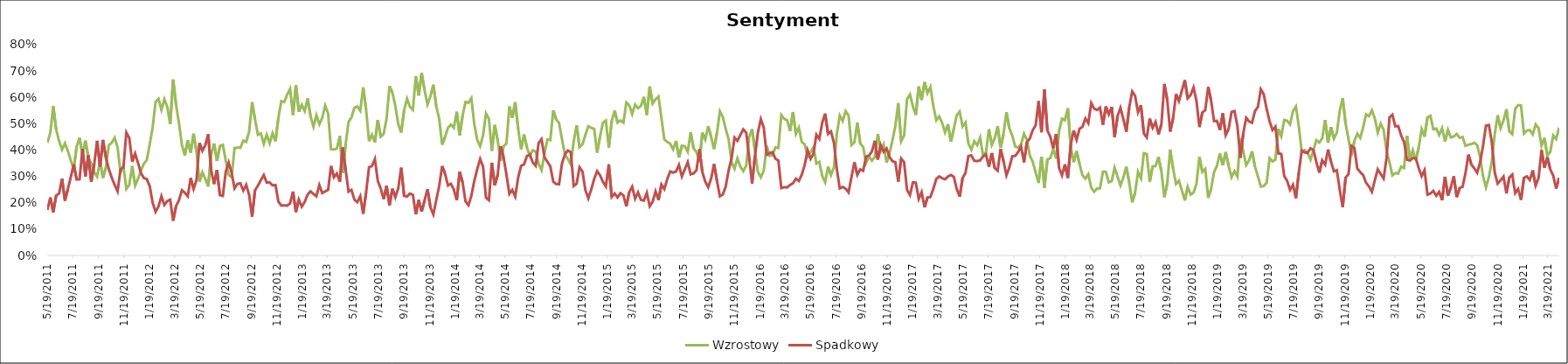
| Category | Wzrostowy | Spadkowy |
|---|---|---|
| 5/19/11 | 0.428 | 0.173 |
| 5/26/11 | 0.465 | 0.22 |
| 6/2/11 | 0.567 | 0.164 |
| 6/9/11 | 0.478 | 0.228 |
| 6/16/11 | 0.434 | 0.235 |
| 6/23/11 | 0.402 | 0.291 |
| 6/30/11 | 0.426 | 0.208 |
| 7/7/11 | 0.397 | 0.252 |
| 7/14/11 | 0.36 | 0.297 |
| 7/21/11 | 0.327 | 0.346 |
| 7/28/11 | 0.413 | 0.288 |
| 8/4/11 | 0.446 | 0.289 |
| 8/11/11 | 0.382 | 0.403 |
| 8/18/11 | 0.436 | 0.3 |
| 8/25/11 | 0.372 | 0.38 |
| 9/1/11 | 0.349 | 0.279 |
| 9/8/11 | 0.317 | 0.345 |
| 9/15/11 | 0.299 | 0.435 |
| 9/22/11 | 0.358 | 0.338 |
| 9/29/11 | 0.295 | 0.438 |
| 10/6/11 | 0.333 | 0.372 |
| 10/13/11 | 0.418 | 0.328 |
| 10/20/11 | 0.427 | 0.295 |
| 10/27/11 | 0.447 | 0.268 |
| 11/3/11 | 0.41 | 0.244 |
| 11/10/11 | 0.315 | 0.327 |
| 11/17/11 | 0.34 | 0.334 |
| 11/24/11 | 0.252 | 0.466 |
| 12/1/11 | 0.269 | 0.446 |
| 12/8/11 | 0.34 | 0.355 |
| 12/15/11 | 0.265 | 0.387 |
| 12/22/11 | 0.292 | 0.351 |
| 12/29/11 | 0.322 | 0.312 |
| 1/5/12 | 0.348 | 0.294 |
| 1/12/12 | 0.363 | 0.29 |
| 1/19/12 | 0.422 | 0.263 |
| 1/26/12 | 0.487 | 0.2 |
| 2/2/12 | 0.583 | 0.166 |
| 2/9/12 | 0.595 | 0.186 |
| 2/16/12 | 0.553 | 0.225 |
| 2/23/12 | 0.593 | 0.192 |
| 3/1/12 | 0.564 | 0.207 |
| 3/8/12 | 0.498 | 0.212 |
| 3/15/12 | 0.668 | 0.132 |
| 3/22/12 | 0.571 | 0.187 |
| 3/29/12 | 0.503 | 0.21 |
| 4/5/12 | 0.419 | 0.248 |
| 4/12/12 | 0.379 | 0.238 |
| 4/19/12 | 0.436 | 0.225 |
| 4/26/12 | 0.39 | 0.294 |
| 5/3/12 | 0.462 | 0.252 |
| 5/10/12 | 0.393 | 0.286 |
| 5/17/12 | 0.28 | 0.427 |
| 5/24/12 | 0.316 | 0.397 |
| 5/31/12 | 0.291 | 0.419 |
| 6/7/12 | 0.262 | 0.46 |
| 6/14/12 | 0.382 | 0.324 |
| 6/21/12 | 0.425 | 0.271 |
| 6/28/12 | 0.359 | 0.324 |
| 7/5/12 | 0.415 | 0.229 |
| 7/12/12 | 0.42 | 0.226 |
| 7/19/12 | 0.36 | 0.318 |
| 7/26/12 | 0.305 | 0.353 |
| 8/2/12 | 0.297 | 0.314 |
| 8/9/12 | 0.408 | 0.255 |
| 8/16/12 | 0.409 | 0.272 |
| 8/23/12 | 0.409 | 0.274 |
| 8/30/12 | 0.436 | 0.246 |
| 9/6/12 | 0.431 | 0.268 |
| 9/13/12 | 0.47 | 0.229 |
| 9/20/12 | 0.582 | 0.147 |
| 9/27/12 | 0.517 | 0.247 |
| 10/4/12 | 0.458 | 0.265 |
| 10/11/12 | 0.463 | 0.286 |
| 10/18/12 | 0.424 | 0.305 |
| 10/25/12 | 0.458 | 0.277 |
| 11/1/12 | 0.426 | 0.278 |
| 11/8/12 | 0.464 | 0.266 |
| 11/15/12 | 0.433 | 0.267 |
| 11/22/12 | 0.522 | 0.205 |
| 11/29/12 | 0.586 | 0.189 |
| 12/6/12 | 0.582 | 0.19 |
| 12/13/12 | 0.61 | 0.189 |
| 12/20/12 | 0.632 | 0.198 |
| 12/27/12 | 0.533 | 0.243 |
| 1/3/13 | 0.647 | 0.165 |
| 1/10/13 | 0.545 | 0.212 |
| 1/17/13 | 0.571 | 0.185 |
| 1/24/13 | 0.548 | 0.203 |
| 1/31/13 | 0.596 | 0.231 |
| 2/7/13 | 0.528 | 0.243 |
| 2/14/13 | 0.489 | 0.233 |
| 2/21/13 | 0.533 | 0.225 |
| 2/28/13 | 0.498 | 0.267 |
| 3/7/13 | 0.522 | 0.237 |
| 3/14/13 | 0.569 | 0.243 |
| 3/21/13 | 0.539 | 0.249 |
| 3/28/13 | 0.403 | 0.34 |
| 4/4/13 | 0.402 | 0.297 |
| 4/11/13 | 0.406 | 0.311 |
| 4/18/13 | 0.453 | 0.28 |
| 4/25/13 | 0.313 | 0.41 |
| 5/2/13 | 0.422 | 0.325 |
| 5/9/13 | 0.507 | 0.242 |
| 5/16/13 | 0.524 | 0.249 |
| 5/23/13 | 0.561 | 0.212 |
| 5/30/13 | 0.566 | 0.202 |
| 6/6/13 | 0.549 | 0.225 |
| 6/13/13 | 0.638 | 0.158 |
| 6/20/13 | 0.553 | 0.24 |
| 6/27/13 | 0.433 | 0.335 |
| 7/4/13 | 0.458 | 0.34 |
| 7/11/13 | 0.429 | 0.366 |
| 7/18/13 | 0.514 | 0.283 |
| 7/25/13 | 0.451 | 0.254 |
| 8/1/13 | 0.462 | 0.214 |
| 8/8/13 | 0.519 | 0.265 |
| 8/15/13 | 0.642 | 0.19 |
| 8/22/13 | 0.618 | 0.253 |
| 8/29/13 | 0.567 | 0.221 |
| 9/5/13 | 0.498 | 0.255 |
| 9/12/13 | 0.467 | 0.333 |
| 9/19/13 | 0.552 | 0.226 |
| 9/26/13 | 0.595 | 0.224 |
| 10/3/13 | 0.564 | 0.235 |
| 10/10/13 | 0.552 | 0.23 |
| 10/17/13 | 0.68 | 0.156 |
| 10/24/13 | 0.607 | 0.211 |
| 10/31/13 | 0.693 | 0.167 |
| 11/7/13 | 0.627 | 0.209 |
| 11/14/13 | 0.573 | 0.252 |
| 11/21/13 | 0.604 | 0.182 |
| 11/28/13 | 0.648 | 0.155 |
| 12/5/13 | 0.566 | 0.211 |
| 12/12/13 | 0.519 | 0.264 |
| 12/19/13 | 0.42 | 0.339 |
| 12/26/13 | 0.45 | 0.31 |
| 1/2/14 | 0.484 | 0.266 |
| 1/9/14 | 0.497 | 0.272 |
| 1/16/14 | 0.484 | 0.25 |
| 1/23/14 | 0.545 | 0.21 |
| 1/30/14 | 0.455 | 0.317 |
| 2/6/14 | 0.531 | 0.278 |
| 2/13/14 | 0.582 | 0.205 |
| 2/20/14 | 0.579 | 0.191 |
| 2/27/14 | 0.597 | 0.227 |
| 3/6/14 | 0.498 | 0.283 |
| 3/13/14 | 0.439 | 0.327 |
| 3/20/14 | 0.415 | 0.366 |
| 3/27/14 | 0.455 | 0.337 |
| 4/3/14 | 0.539 | 0.219 |
| 4/10/14 | 0.519 | 0.21 |
| 4/17/14 | 0.397 | 0.352 |
| 4/24/14 | 0.495 | 0.266 |
| 5/1/14 | 0.437 | 0.306 |
| 5/8/14 | 0.359 | 0.415 |
| 5/15/14 | 0.414 | 0.374 |
| 5/22/14 | 0.425 | 0.307 |
| 5/29/14 | 0.566 | 0.234 |
| 6/5/14 | 0.522 | 0.249 |
| 6/12/14 | 0.581 | 0.224 |
| 6/19/14 | 0.482 | 0.295 |
| 6/26/14 | 0.403 | 0.34 |
| 7/3/14 | 0.459 | 0.345 |
| 7/10/14 | 0.41 | 0.377 |
| 7/17/14 | 0.379 | 0.383 |
| 7/24/14 | 0.399 | 0.353 |
| 7/31/14 | 0.394 | 0.34 |
| 8/7/14 | 0.348 | 0.427 |
| 8/14/14 | 0.324 | 0.441 |
| 8/21/14 | 0.386 | 0.373 |
| 8/28/14 | 0.44 | 0.356 |
| 9/4/14 | 0.438 | 0.338 |
| 9/11/14 | 0.551 | 0.28 |
| 9/18/14 | 0.516 | 0.271 |
| 9/25/14 | 0.502 | 0.271 |
| 10/2/14 | 0.441 | 0.349 |
| 10/9/14 | 0.383 | 0.383 |
| 10/16/14 | 0.366 | 0.398 |
| 10/23/14 | 0.345 | 0.392 |
| 10/30/14 | 0.433 | 0.264 |
| 11/6/14 | 0.494 | 0.272 |
| 11/13/14 | 0.411 | 0.335 |
| 11/20/14 | 0.422 | 0.319 |
| 11/27/14 | 0.457 | 0.248 |
| 12/4/14 | 0.49 | 0.217 |
| 12/11/14 | 0.484 | 0.251 |
| 12/18/14 | 0.481 | 0.29 |
| 12/25/14 | 0.39 | 0.32 |
| 1/1/15 | 0.451 | 0.304 |
| 1/8/15 | 0.503 | 0.28 |
| 1/15/15 | 0.512 | 0.262 |
| 1/22/15 | 0.409 | 0.346 |
| 1/29/15 | 0.511 | 0.222 |
| 2/5/15 | 0.55 | 0.235 |
| 2/12/15 | 0.504 | 0.22 |
| 2/19/15 | 0.512 | 0.236 |
| 2/26/15 | 0.504 | 0.228 |
| 3/5/15 | 0.581 | 0.186 |
| 3/12/15 | 0.57 | 0.241 |
| 3/19/15 | 0.537 | 0.261 |
| 3/26/15 | 0.573 | 0.216 |
| 4/2/15 | 0.559 | 0.239 |
| 4/9/15 | 0.568 | 0.211 |
| 4/16/15 | 0.602 | 0.208 |
| 4/23/15 | 0.533 | 0.238 |
| 4/30/15 | 0.641 | 0.187 |
| 5/7/15 | 0.577 | 0.204 |
| 5/14/15 | 0.593 | 0.243 |
| 5/21/15 | 0.603 | 0.21 |
| 5/28/15 | 0.521 | 0.269 |
| 6/4/15 | 0.44 | 0.252 |
| 6/11/15 | 0.431 | 0.29 |
| 6/18/15 | 0.424 | 0.319 |
| 6/25/15 | 0.403 | 0.314 |
| 7/2/15 | 0.435 | 0.319 |
| 7/9/15 | 0.372 | 0.344 |
| 7/16/15 | 0.416 | 0.3 |
| 7/23/15 | 0.415 | 0.327 |
| 7/30/15 | 0.393 | 0.354 |
| 8/6/15 | 0.467 | 0.308 |
| 8/13/15 | 0.407 | 0.311 |
| 8/20/15 | 0.392 | 0.324 |
| 8/27/15 | 0.357 | 0.403 |
| 9/3/15 | 0.466 | 0.316 |
| 9/10/15 | 0.44 | 0.28 |
| 9/17/15 | 0.49 | 0.259 |
| 9/24/15 | 0.451 | 0.292 |
| 10/1/15 | 0.404 | 0.347 |
| 10/8/15 | 0.466 | 0.283 |
| 10/15/15 | 0.547 | 0.224 |
| 10/22/15 | 0.525 | 0.231 |
| 10/29/15 | 0.479 | 0.262 |
| 11/5/15 | 0.44 | 0.324 |
| 11/12/15 | 0.354 | 0.369 |
| 11/19/15 | 0.329 | 0.447 |
| 11/26/15 | 0.369 | 0.435 |
| 12/3/15 | 0.337 | 0.457 |
| 12/10/15 | 0.32 | 0.478 |
| 12/17/15 | 0.341 | 0.466 |
| 12/24/15 | 0.449 | 0.374 |
| 12/31/15 | 0.479 | 0.273 |
| 1/7/16 | 0.398 | 0.378 |
| 1/14/16 | 0.317 | 0.466 |
| 1/21/16 | 0.297 | 0.517 |
| 1/28/16 | 0.322 | 0.485 |
| 2/4/16 | 0.415 | 0.382 |
| 2/11/16 | 0.378 | 0.388 |
| 2/18/16 | 0.381 | 0.392 |
| 2/25/16 | 0.41 | 0.367 |
| 3/3/16 | 0.408 | 0.36 |
| 3/10/16 | 0.533 | 0.256 |
| 3/17/16 | 0.518 | 0.259 |
| 3/24/16 | 0.513 | 0.258 |
| 3/31/16 | 0.472 | 0.268 |
| 4/7/16 | 0.544 | 0.274 |
| 4/14/16 | 0.461 | 0.292 |
| 4/21/16 | 0.485 | 0.283 |
| 4/28/16 | 0.43 | 0.307 |
| 5/5/16 | 0.422 | 0.343 |
| 5/12/16 | 0.375 | 0.399 |
| 5/19/16 | 0.392 | 0.367 |
| 5/26/16 | 0.411 | 0.386 |
| 6/2/16 | 0.349 | 0.458 |
| 6/9/16 | 0.355 | 0.442 |
| 6/16/16 | 0.302 | 0.504 |
| 6/23/16 | 0.278 | 0.538 |
| 6/30/16 | 0.337 | 0.461 |
| 7/7/16 | 0.305 | 0.471 |
| 7/14/16 | 0.333 | 0.428 |
| 7/21/16 | 0.462 | 0.327 |
| 7/28/16 | 0.531 | 0.254 |
| 8/4/16 | 0.51 | 0.26 |
| 8/11/16 | 0.548 | 0.253 |
| 8/18/16 | 0.531 | 0.239 |
| 8/25/16 | 0.419 | 0.297 |
| 9/1/16 | 0.429 | 0.354 |
| 9/8/16 | 0.504 | 0.306 |
| 9/15/16 | 0.424 | 0.327 |
| 9/22/16 | 0.412 | 0.321 |
| 9/29/16 | 0.351 | 0.375 |
| 10/6/16 | 0.375 | 0.379 |
| 10/13/16 | 0.36 | 0.395 |
| 10/20/16 | 0.375 | 0.435 |
| 10/27/16 | 0.461 | 0.364 |
| 11/3/16 | 0.396 | 0.419 |
| 11/10/16 | 0.421 | 0.394 |
| 11/17/16 | 0.353 | 0.406 |
| 11/24/16 | 0.387 | 0.374 |
| 12/1/16 | 0.436 | 0.358 |
| 12/8/16 | 0.491 | 0.354 |
| 12/15/16 | 0.578 | 0.28 |
| 12/22/16 | 0.433 | 0.368 |
| 12/29/16 | 0.455 | 0.354 |
| 1/5/17 | 0.593 | 0.249 |
| 1/12/17 | 0.611 | 0.229 |
| 1/19/17 | 0.566 | 0.277 |
| 1/26/17 | 0.533 | 0.277 |
| 2/2/17 | 0.641 | 0.215 |
| 2/9/17 | 0.59 | 0.24 |
| 2/16/17 | 0.658 | 0.183 |
| 2/23/17 | 0.616 | 0.22 |
| 3/2/17 | 0.639 | 0.222 |
| 3/9/17 | 0.568 | 0.253 |
| 3/16/17 | 0.513 | 0.29 |
| 3/23/17 | 0.528 | 0.3 |
| 3/30/17 | 0.503 | 0.293 |
| 4/6/17 | 0.467 | 0.289 |
| 4/13/17 | 0.498 | 0.3 |
| 4/20/17 | 0.432 | 0.306 |
| 4/27/17 | 0.481 | 0.298 |
| 5/4/17 | 0.532 | 0.252 |
| 5/11/17 | 0.546 | 0.223 |
| 5/18/17 | 0.49 | 0.294 |
| 5/25/17 | 0.505 | 0.314 |
| 6/1/17 | 0.425 | 0.377 |
| 6/8/17 | 0.402 | 0.38 |
| 6/15/17 | 0.434 | 0.359 |
| 6/22/17 | 0.419 | 0.358 |
| 6/29/17 | 0.447 | 0.361 |
| 7/6/17 | 0.379 | 0.375 |
| 7/13/17 | 0.391 | 0.384 |
| 7/20/17 | 0.479 | 0.336 |
| 7/27/17 | 0.42 | 0.389 |
| 8/3/17 | 0.445 | 0.332 |
| 8/10/17 | 0.49 | 0.322 |
| 8/17/17 | 0.409 | 0.405 |
| 8/24/17 | 0.46 | 0.358 |
| 8/31/17 | 0.544 | 0.304 |
| 9/7/17 | 0.482 | 0.335 |
| 9/14/17 | 0.455 | 0.377 |
| 9/21/17 | 0.413 | 0.378 |
| 9/28/17 | 0.409 | 0.392 |
| 10/5/17 | 0.422 | 0.414 |
| 10/12/17 | 0.462 | 0.353 |
| 10/19/17 | 0.439 | 0.43 |
| 10/26/17 | 0.379 | 0.444 |
| 11/2/17 | 0.355 | 0.475 |
| 11/9/17 | 0.315 | 0.494 |
| 11/16/17 | 0.275 | 0.586 |
| 11/23/17 | 0.375 | 0.467 |
| 11/30/17 | 0.257 | 0.63 |
| 12/7/17 | 0.364 | 0.475 |
| 12/14/17 | 0.369 | 0.451 |
| 12/21/17 | 0.403 | 0.407 |
| 12/28/17 | 0.368 | 0.461 |
| 1/4/18 | 0.473 | 0.332 |
| 1/11/18 | 0.519 | 0.304 |
| 1/18/18 | 0.513 | 0.346 |
| 1/25/18 | 0.559 | 0.294 |
| 2/1/18 | 0.412 | 0.421 |
| 2/8/18 | 0.354 | 0.474 |
| 2/15/18 | 0.396 | 0.439 |
| 2/22/18 | 0.347 | 0.481 |
| 3/1/18 | 0.305 | 0.488 |
| 3/8/18 | 0.291 | 0.52 |
| 3/15/18 | 0.308 | 0.502 |
| 3/22/18 | 0.257 | 0.578 |
| 3/29/18 | 0.242 | 0.557 |
| 4/5/18 | 0.254 | 0.552 |
| 4/12/18 | 0.255 | 0.561 |
| 4/19/18 | 0.318 | 0.496 |
| 4/26/18 | 0.317 | 0.565 |
| 5/3/18 | 0.278 | 0.535 |
| 5/10/18 | 0.282 | 0.564 |
| 5/17/18 | 0.333 | 0.449 |
| 5/24/18 | 0.299 | 0.529 |
| 5/31/18 | 0.266 | 0.56 |
| 6/7/18 | 0.297 | 0.517 |
| 6/14/18 | 0.336 | 0.469 |
| 6/21/18 | 0.277 | 0.562 |
| 6/28/18 | 0.202 | 0.622 |
| 7/5/18 | 0.238 | 0.606 |
| 7/12/18 | 0.317 | 0.543 |
| 7/19/18 | 0.293 | 0.57 |
| 7/26/18 | 0.388 | 0.463 |
| 8/2/18 | 0.385 | 0.448 |
| 8/9/18 | 0.279 | 0.52 |
| 8/16/18 | 0.338 | 0.484 |
| 8/23/18 | 0.339 | 0.507 |
| 8/30/18 | 0.374 | 0.46 |
| 9/6/18 | 0.32 | 0.498 |
| 9/13/18 | 0.221 | 0.651 |
| 9/20/18 | 0.273 | 0.59 |
| 9/27/18 | 0.402 | 0.47 |
| 10/4/18 | 0.329 | 0.521 |
| 10/11/18 | 0.271 | 0.612 |
| 10/18/18 | 0.284 | 0.585 |
| 10/25/18 | 0.247 | 0.626 |
| 11/1/18 | 0.209 | 0.665 |
| 11/8/18 | 0.26 | 0.596 |
| 11/15/18 | 0.231 | 0.609 |
| 11/22/18 | 0.239 | 0.637 |
| 11/29/18 | 0.272 | 0.585 |
| 12/6/18 | 0.374 | 0.487 |
| 12/13/18 | 0.317 | 0.543 |
| 12/20/18 | 0.328 | 0.551 |
| 12/27/18 | 0.219 | 0.639 |
| 1/3/19 | 0.253 | 0.588 |
| 1/10/19 | 0.316 | 0.51 |
| 1/17/19 | 0.341 | 0.511 |
| 1/24/19 | 0.387 | 0.476 |
| 1/31/19 | 0.343 | 0.539 |
| 2/7/19 | 0.392 | 0.457 |
| 2/14/19 | 0.339 | 0.481 |
| 2/21/19 | 0.297 | 0.545 |
| 2/28/19 | 0.32 | 0.548 |
| 3/7/19 | 0.3 | 0.491 |
| 3/14/19 | 0.444 | 0.371 |
| 3/21/19 | 0.394 | 0.463 |
| 3/28/19 | 0.343 | 0.522 |
| 4/4/19 | 0.361 | 0.508 |
| 4/11/19 | 0.396 | 0.504 |
| 4/18/19 | 0.337 | 0.548 |
| 4/25/19 | 0.301 | 0.564 |
| 5/2/19 | 0.261 | 0.631 |
| 5/9/19 | 0.264 | 0.612 |
| 5/16/19 | 0.276 | 0.556 |
| 5/23/19 | 0.369 | 0.51 |
| 5/30/19 | 0.357 | 0.476 |
| 6/6/19 | 0.364 | 0.489 |
| 6/13/19 | 0.48 | 0.387 |
| 6/20/19 | 0.453 | 0.385 |
| 6/27/19 | 0.514 | 0.302 |
| 7/4/19 | 0.511 | 0.283 |
| 7/11/19 | 0.497 | 0.249 |
| 7/18/19 | 0.547 | 0.268 |
| 7/25/19 | 0.565 | 0.217 |
| 8/1/19 | 0.49 | 0.315 |
| 8/8/19 | 0.393 | 0.398 |
| 8/15/19 | 0.4 | 0.391 |
| 8/22/19 | 0.389 | 0.389 |
| 8/29/19 | 0.364 | 0.407 |
| 9/5/19 | 0.4 | 0.4 |
| 9/12/19 | 0.438 | 0.354 |
| 9/19/19 | 0.429 | 0.314 |
| 9/26/19 | 0.444 | 0.361 |
| 10/3/19 | 0.514 | 0.345 |
| 10/10/19 | 0.428 | 0.402 |
| 10/17/19 | 0.487 | 0.356 |
| 10/24/19 | 0.443 | 0.32 |
| 10/31/19 | 0.466 | 0.324 |
| 11/7/19 | 0.549 | 0.249 |
| 11/14/19 | 0.597 | 0.183 |
| 11/21/19 | 0.5 | 0.295 |
| 11/28/19 | 0.441 | 0.309 |
| 12/5/19 | 0.379 | 0.416 |
| 12/12/19 | 0.435 | 0.408 |
| 12/19/19 | 0.462 | 0.33 |
| 12/26/19 | 0.446 | 0.317 |
| 1/2/20 | 0.486 | 0.305 |
| 1/9/20 | 0.536 | 0.276 |
| 1/16/20 | 0.528 | 0.262 |
| 1/23/20 | 0.551 | 0.242 |
| 1/30/20 | 0.519 | 0.286 |
| 2/6/20 | 0.466 | 0.327 |
| 2/13/20 | 0.5 | 0.309 |
| 2/20/20 | 0.477 | 0.292 |
| 2/27/20 | 0.396 | 0.37 |
| 3/5/20 | 0.354 | 0.524 |
| 3/12/20 | 0.304 | 0.534 |
| 3/19/20 | 0.313 | 0.49 |
| 3/26/20 | 0.311 | 0.491 |
| 4/2/20 | 0.337 | 0.455 |
| 4/9/20 | 0.332 | 0.43 |
| 4/16/20 | 0.455 | 0.364 |
| 4/23/20 | 0.36 | 0.36 |
| 4/30/20 | 0.399 | 0.37 |
| 5/7/20 | 0.36 | 0.369 |
| 5/14/20 | 0.41 | 0.332 |
| 5/21/20 | 0.48 | 0.301 |
| 5/28/20 | 0.451 | 0.324 |
| 6/4/20 | 0.524 | 0.231 |
| 6/11/20 | 0.53 | 0.235 |
| 6/18/20 | 0.479 | 0.245 |
| 6/25/20 | 0.482 | 0.227 |
| 7/2/20 | 0.457 | 0.241 |
| 7/9/20 | 0.483 | 0.21 |
| 7/16/20 | 0.433 | 0.299 |
| 7/23/20 | 0.477 | 0.227 |
| 7/30/20 | 0.448 | 0.259 |
| 8/6/20 | 0.451 | 0.301 |
| 8/13/20 | 0.461 | 0.222 |
| 8/20/20 | 0.446 | 0.256 |
| 8/27/20 | 0.45 | 0.26 |
| 9/3/20 | 0.416 | 0.312 |
| 9/10/20 | 0.42 | 0.383 |
| 9/17/20 | 0.423 | 0.345 |
| 9/24/20 | 0.428 | 0.331 |
| 10/1/20 | 0.419 | 0.314 |
| 10/8/20 | 0.373 | 0.353 |
| 10/15/20 | 0.301 | 0.416 |
| 10/22/20 | 0.259 | 0.493 |
| 10/29/20 | 0.297 | 0.495 |
| 11/5/20 | 0.357 | 0.43 |
| 11/12/20 | 0.46 | 0.316 |
| 11/19/20 | 0.532 | 0.273 |
| 11/26/20 | 0.483 | 0.285 |
| 12/3/20 | 0.513 | 0.299 |
| 12/10/20 | 0.555 | 0.236 |
| 12/17/20 | 0.471 | 0.296 |
| 12/24/20 | 0.46 | 0.307 |
| 12/31/20 | 0.556 | 0.237 |
| 1/7/21 | 0.571 | 0.253 |
| 1/14/21 | 0.569 | 0.211 |
| 1/21/21 | 0.462 | 0.295 |
| 1/28/21 | 0.474 | 0.3 |
| 2/4/21 | 0.476 | 0.286 |
| 2/11/21 | 0.46 | 0.323 |
| 2/18/21 | 0.497 | 0.265 |
| 2/25/21 | 0.483 | 0.294 |
| 3/4/21 | 0.417 | 0.4 |
| 3/11/21 | 0.446 | 0.333 |
| 3/18/21 | 0.379 | 0.373 |
| 3/25/21 | 0.394 | 0.326 |
| 4/1/21 | 0.456 | 0.304 |
| 4/8/21 | 0.442 | 0.254 |
| 4/15/21 | 0.485 | 0.294 |